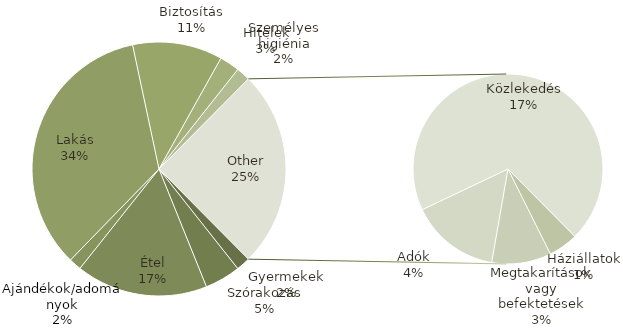
| Category | Összeg |
|---|---|
| Gyermekek | 140 |
| Szórakozás | 358 |
| Étel | 1320 |
| Ajándékok/adományok | 125 |
| Lakás | 2702 |
| Biztosítás | 900 |
| Hitelek | 200 |
| Személyes higiénia | 140 |
| Háziállatok | 100 |
| Megtakarítások vagy befektetések | 200 |
| Adók | 300 |
| Közlekedés | 1375 |